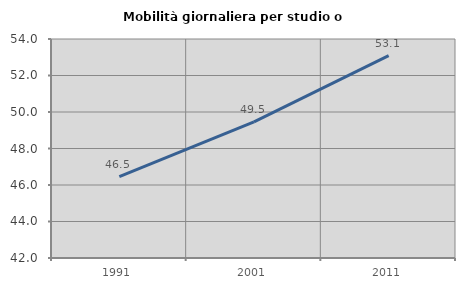
| Category | Mobilità giornaliera per studio o lavoro |
|---|---|
| 1991.0 | 46.464 |
| 2001.0 | 49.459 |
| 2011.0 | 53.093 |